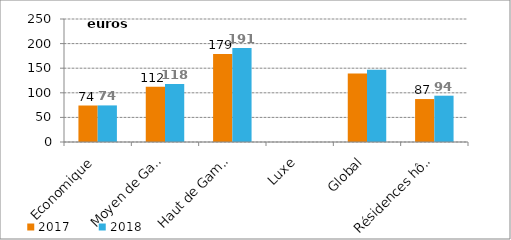
| Category | 2017 | 2018 |
|---|---|---|
| Economique | 74.171 | 74.368 |
| Moyen de Gamme | 112.462 | 118.039 |
| Haut de Gamme | 178.883 | 190.995 |
| Luxe | 0 | 0 |
| Global | 139.087 | 146.605 |
| Résidences hôtelières | 87.308 | 94.121 |